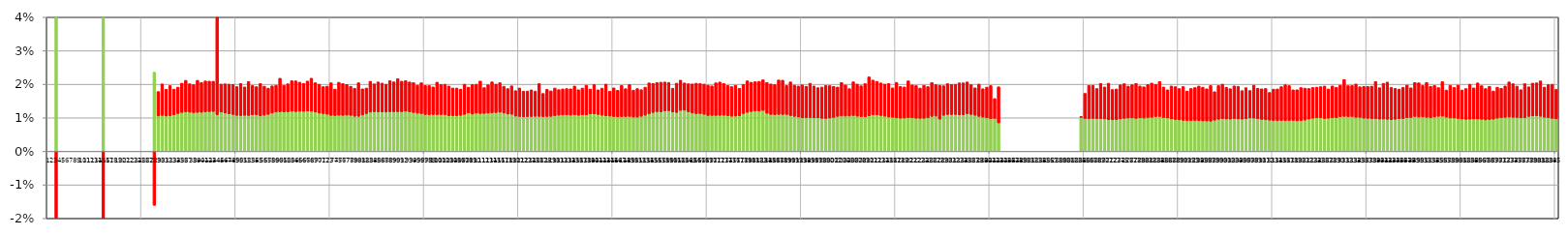
| Category | Тех потери % | НБф % |
|---|---|---|
| 0 | 0 | 0 |
| 1 | 0 | 0 |
| 2 | 1.826 | -1.804 |
| 3 | 0 | 0 |
| 4 | 0 | 0 |
| 5 | 0 | 0 |
| 6 | 0 | 0 |
| 7 | 0 | 0 |
| 8 | 0 | 0 |
| 9 | 0 | 0 |
| 10 | 0 | 0 |
| 11 | 0 | 0 |
| 12 | 0 | 0 |
| 13 | 0 | 0 |
| 14 | 1.826 | -1.856 |
| 15 | 0 | 0 |
| 16 | 0 | 0 |
| 17 | 0 | 0 |
| 18 | 0 | 0 |
| 19 | 0 | 0 |
| 20 | 0 | 0 |
| 21 | 0 | 0 |
| 22 | 0 | 0 |
| 23 | 0 | 0 |
| 24 | 0 | 0 |
| 25 | 0 | 0 |
| 26 | 0 | 0 |
| 27 | 0.024 | -0.016 |
| 28 | 0.011 | 0.007 |
| 29 | 0.011 | 0.009 |
| 30 | 0.011 | 0.008 |
| 31 | 0.011 | 0.009 |
| 32 | 0.011 | 0.008 |
| 33 | 0.011 | 0.008 |
| 34 | 0.012 | 0.009 |
| 35 | 0.012 | 0.009 |
| 36 | 0.012 | 0.008 |
| 37 | 0.012 | 0.008 |
| 38 | 0.012 | 0.01 |
| 39 | 0.012 | 0.009 |
| 40 | 0.012 | 0.009 |
| 41 | 0.012 | 0.009 |
| 42 | 0.012 | 0.009 |
| 43 | 0.011 | 0.059 |
| 44 | 0.012 | 0.008 |
| 45 | 0.011 | 0.009 |
| 46 | 0.011 | 0.009 |
| 47 | 0.011 | 0.009 |
| 48 | 0.011 | 0.009 |
| 49 | 0.011 | 0.01 |
| 50 | 0.011 | 0.008 |
| 51 | 0.011 | 0.01 |
| 52 | 0.011 | 0.009 |
| 53 | 0.011 | 0.008 |
| 54 | 0.011 | 0.01 |
| 55 | 0.011 | 0.009 |
| 56 | 0.011 | 0.008 |
| 57 | 0.011 | 0.008 |
| 58 | 0.012 | 0.008 |
| 59 | 0.012 | 0.01 |
| 60 | 0.012 | 0.008 |
| 61 | 0.012 | 0.008 |
| 62 | 0.012 | 0.009 |
| 63 | 0.012 | 0.009 |
| 64 | 0.012 | 0.009 |
| 65 | 0.012 | 0.008 |
| 66 | 0.012 | 0.009 |
| 67 | 0.012 | 0.01 |
| 68 | 0.012 | 0.009 |
| 69 | 0.011 | 0.009 |
| 70 | 0.011 | 0.008 |
| 71 | 0.011 | 0.008 |
| 72 | 0.011 | 0.01 |
| 73 | 0.011 | 0.008 |
| 74 | 0.011 | 0.01 |
| 75 | 0.011 | 0.009 |
| 76 | 0.011 | 0.009 |
| 77 | 0.011 | 0.009 |
| 78 | 0.01 | 0.008 |
| 79 | 0.01 | 0.01 |
| 80 | 0.011 | 0.008 |
| 81 | 0.011 | 0.008 |
| 82 | 0.012 | 0.009 |
| 83 | 0.012 | 0.008 |
| 84 | 0.012 | 0.009 |
| 85 | 0.012 | 0.009 |
| 86 | 0.012 | 0.008 |
| 87 | 0.012 | 0.009 |
| 88 | 0.012 | 0.009 |
| 89 | 0.012 | 0.01 |
| 90 | 0.012 | 0.009 |
| 91 | 0.012 | 0.009 |
| 92 | 0.012 | 0.009 |
| 93 | 0.012 | 0.009 |
| 94 | 0.011 | 0.008 |
| 95 | 0.011 | 0.009 |
| 96 | 0.011 | 0.009 |
| 97 | 0.011 | 0.009 |
| 98 | 0.011 | 0.008 |
| 99 | 0.011 | 0.01 |
| 100 | 0.011 | 0.009 |
| 101 | 0.011 | 0.009 |
| 102 | 0.011 | 0.009 |
| 103 | 0.011 | 0.008 |
| 104 | 0.011 | 0.008 |
| 105 | 0.011 | 0.008 |
| 106 | 0.011 | 0.009 |
| 107 | 0.011 | 0.008 |
| 108 | 0.011 | 0.009 |
| 109 | 0.011 | 0.009 |
| 110 | 0.011 | 0.01 |
| 111 | 0.011 | 0.008 |
| 112 | 0.011 | 0.008 |
| 113 | 0.011 | 0.009 |
| 114 | 0.012 | 0.009 |
| 115 | 0.012 | 0.009 |
| 116 | 0.011 | 0.008 |
| 117 | 0.011 | 0.008 |
| 118 | 0.011 | 0.008 |
| 119 | 0.011 | 0.008 |
| 120 | 0.01 | 0.009 |
| 121 | 0.01 | 0.008 |
| 122 | 0.01 | 0.008 |
| 123 | 0.01 | 0.008 |
| 124 | 0.01 | 0.008 |
| 125 | 0.01 | 0.01 |
| 126 | 0.01 | 0.007 |
| 127 | 0.01 | 0.008 |
| 128 | 0.01 | 0.008 |
| 129 | 0.011 | 0.008 |
| 130 | 0.011 | 0.008 |
| 131 | 0.011 | 0.008 |
| 132 | 0.011 | 0.008 |
| 133 | 0.011 | 0.008 |
| 134 | 0.011 | 0.009 |
| 135 | 0.011 | 0.008 |
| 136 | 0.011 | 0.008 |
| 137 | 0.011 | 0.009 |
| 138 | 0.011 | 0.007 |
| 139 | 0.011 | 0.009 |
| 140 | 0.011 | 0.007 |
| 141 | 0.011 | 0.008 |
| 142 | 0.011 | 0.009 |
| 143 | 0.011 | 0.007 |
| 144 | 0.01 | 0.009 |
| 145 | 0.01 | 0.008 |
| 146 | 0.01 | 0.009 |
| 147 | 0.01 | 0.008 |
| 148 | 0.01 | 0.01 |
| 149 | 0.01 | 0.008 |
| 150 | 0.01 | 0.009 |
| 151 | 0.01 | 0.008 |
| 152 | 0.011 | 0.008 |
| 153 | 0.011 | 0.009 |
| 154 | 0.012 | 0.009 |
| 155 | 0.012 | 0.009 |
| 156 | 0.012 | 0.009 |
| 157 | 0.012 | 0.009 |
| 158 | 0.012 | 0.008 |
| 159 | 0.012 | 0.007 |
| 160 | 0.012 | 0.009 |
| 161 | 0.012 | 0.009 |
| 162 | 0.012 | 0.008 |
| 163 | 0.012 | 0.008 |
| 164 | 0.011 | 0.009 |
| 165 | 0.011 | 0.009 |
| 166 | 0.011 | 0.009 |
| 167 | 0.011 | 0.009 |
| 168 | 0.011 | 0.009 |
| 169 | 0.011 | 0.009 |
| 170 | 0.011 | 0.01 |
| 171 | 0.011 | 0.01 |
| 172 | 0.011 | 0.009 |
| 173 | 0.011 | 0.009 |
| 174 | 0.01 | 0.009 |
| 175 | 0.011 | 0.009 |
| 176 | 0.011 | 0.008 |
| 177 | 0.011 | 0.009 |
| 178 | 0.012 | 0.009 |
| 179 | 0.012 | 0.009 |
| 180 | 0.012 | 0.009 |
| 181 | 0.012 | 0.009 |
| 182 | 0.012 | 0.009 |
| 183 | 0.011 | 0.009 |
| 184 | 0.011 | 0.009 |
| 185 | 0.011 | 0.009 |
| 186 | 0.011 | 0.01 |
| 187 | 0.011 | 0.01 |
| 188 | 0.011 | 0.009 |
| 189 | 0.011 | 0.01 |
| 190 | 0.01 | 0.009 |
| 191 | 0.01 | 0.009 |
| 192 | 0.01 | 0.01 |
| 193 | 0.01 | 0.009 |
| 194 | 0.01 | 0.01 |
| 195 | 0.01 | 0.01 |
| 196 | 0.01 | 0.009 |
| 197 | 0.01 | 0.009 |
| 198 | 0.01 | 0.01 |
| 199 | 0.01 | 0.01 |
| 200 | 0.01 | 0.009 |
| 201 | 0.01 | 0.009 |
| 202 | 0.011 | 0.01 |
| 203 | 0.011 | 0.009 |
| 204 | 0.011 | 0.008 |
| 205 | 0.011 | 0.01 |
| 206 | 0.01 | 0.01 |
| 207 | 0.01 | 0.009 |
| 208 | 0.01 | 0.01 |
| 209 | 0.011 | 0.012 |
| 210 | 0.011 | 0.01 |
| 211 | 0.011 | 0.01 |
| 212 | 0.011 | 0.01 |
| 213 | 0.01 | 0.01 |
| 214 | 0.01 | 0.01 |
| 215 | 0.01 | 0.009 |
| 216 | 0.01 | 0.011 |
| 217 | 0.01 | 0.009 |
| 218 | 0.01 | 0.009 |
| 219 | 0.01 | 0.011 |
| 220 | 0.01 | 0.01 |
| 221 | 0.01 | 0.01 |
| 222 | 0.01 | 0.009 |
| 223 | 0.01 | 0.01 |
| 224 | 0.01 | 0.009 |
| 225 | 0.01 | 0.01 |
| 226 | 0.011 | 0.009 |
| 227 | 0.01 | 0.01 |
| 228 | 0.011 | 0.009 |
| 229 | 0.011 | 0.009 |
| 230 | 0.011 | 0.009 |
| 231 | 0.011 | 0.009 |
| 232 | 0.011 | 0.01 |
| 233 | 0.011 | 0.01 |
| 234 | 0.011 | 0.009 |
| 235 | 0.011 | 0.009 |
| 236 | 0.011 | 0.008 |
| 237 | 0.01 | 0.01 |
| 238 | 0.01 | 0.008 |
| 239 | 0.01 | 0.009 |
| 240 | 0.01 | 0.01 |
| 241 | 0.01 | 0.006 |
| 242 | 0.008 | 0.011 |
| 243 | 0 | 0 |
| 244 | 0 | 0 |
| 245 | 0 | 0 |
| 246 | 0 | 0 |
| 247 | 0 | 0 |
| 248 | 0 | 0 |
| 249 | 0 | 0 |
| 250 | 0 | 0 |
| 251 | 0 | 0 |
| 252 | 0 | 0 |
| 253 | 0 | 0 |
| 254 | 0 | 0 |
| 255 | 0 | 0 |
| 256 | 0 | 0 |
| 257 | 0 | 0 |
| 258 | 0 | 0 |
| 259 | 0 | 0 |
| 260 | 0 | 0 |
| 261 | 0 | 0 |
| 262 | 0 | 0 |
| 263 | 0.01 | 0 |
| 264 | 0.01 | 0.007 |
| 265 | 0.01 | 0.01 |
| 266 | 0.01 | 0.01 |
| 267 | 0.01 | 0.009 |
| 268 | 0.01 | 0.011 |
| 269 | 0.01 | 0.01 |
| 270 | 0.009 | 0.011 |
| 271 | 0.009 | 0.009 |
| 272 | 0.009 | 0.009 |
| 273 | 0.01 | 0.01 |
| 274 | 0.01 | 0.01 |
| 275 | 0.01 | 0.01 |
| 276 | 0.01 | 0.01 |
| 277 | 0.01 | 0.01 |
| 278 | 0.01 | 0.01 |
| 279 | 0.01 | 0.009 |
| 280 | 0.01 | 0.01 |
| 281 | 0.01 | 0.01 |
| 282 | 0.01 | 0.01 |
| 283 | 0.01 | 0.01 |
| 284 | 0.01 | 0.009 |
| 285 | 0.01 | 0.008 |
| 286 | 0.01 | 0.01 |
| 287 | 0.009 | 0.01 |
| 288 | 0.009 | 0.009 |
| 289 | 0.009 | 0.01 |
| 290 | 0.009 | 0.009 |
| 291 | 0.009 | 0.01 |
| 292 | 0.009 | 0.01 |
| 293 | 0.009 | 0.01 |
| 294 | 0.009 | 0.01 |
| 295 | 0.009 | 0.01 |
| 296 | 0.009 | 0.011 |
| 297 | 0.009 | 0.009 |
| 298 | 0.01 | 0.01 |
| 299 | 0.01 | 0.01 |
| 300 | 0.01 | 0.009 |
| 301 | 0.01 | 0.009 |
| 302 | 0.01 | 0.01 |
| 303 | 0.01 | 0.01 |
| 304 | 0.01 | 0.008 |
| 305 | 0.01 | 0.009 |
| 306 | 0.01 | 0.008 |
| 307 | 0.01 | 0.01 |
| 308 | 0.01 | 0.009 |
| 309 | 0.01 | 0.009 |
| 310 | 0.009 | 0.009 |
| 311 | 0.009 | 0.008 |
| 312 | 0.009 | 0.009 |
| 313 | 0.009 | 0.009 |
| 314 | 0.009 | 0.01 |
| 315 | 0.009 | 0.011 |
| 316 | 0.009 | 0.01 |
| 317 | 0.009 | 0.009 |
| 318 | 0.009 | 0.009 |
| 319 | 0.009 | 0.01 |
| 320 | 0.009 | 0.01 |
| 321 | 0.01 | 0.009 |
| 322 | 0.01 | 0.009 |
| 323 | 0.01 | 0.009 |
| 324 | 0.01 | 0.009 |
| 325 | 0.01 | 0.01 |
| 326 | 0.01 | 0.009 |
| 327 | 0.01 | 0.009 |
| 328 | 0.01 | 0.009 |
| 329 | 0.01 | 0.009 |
| 330 | 0.01 | 0.011 |
| 331 | 0.01 | 0.009 |
| 332 | 0.01 | 0.009 |
| 333 | 0.01 | 0.01 |
| 334 | 0.01 | 0.009 |
| 335 | 0.01 | 0.009 |
| 336 | 0.01 | 0.01 |
| 337 | 0.01 | 0.01 |
| 338 | 0.01 | 0.011 |
| 339 | 0.01 | 0.009 |
| 340 | 0.01 | 0.011 |
| 341 | 0.01 | 0.011 |
| 342 | 0.009 | 0.01 |
| 343 | 0.01 | 0.009 |
| 344 | 0.01 | 0.009 |
| 345 | 0.01 | 0.009 |
| 346 | 0.01 | 0.01 |
| 347 | 0.01 | 0.009 |
| 348 | 0.01 | 0.01 |
| 349 | 0.01 | 0.01 |
| 350 | 0.01 | 0.009 |
| 351 | 0.01 | 0.01 |
| 352 | 0.01 | 0.009 |
| 353 | 0.01 | 0.009 |
| 354 | 0.01 | 0.009 |
| 355 | 0.01 | 0.01 |
| 356 | 0.01 | 0.008 |
| 357 | 0.01 | 0.01 |
| 358 | 0.01 | 0.009 |
| 359 | 0.01 | 0.01 |
| 360 | 0.01 | 0.009 |
| 361 | 0.01 | 0.009 |
| 362 | 0.01 | 0.01 |
| 363 | 0.01 | 0.009 |
| 364 | 0.01 | 0.011 |
| 365 | 0.01 | 0.01 |
| 366 | 0.009 | 0.009 |
| 367 | 0.009 | 0.01 |
| 368 | 0.01 | 0.008 |
| 369 | 0.01 | 0.009 |
| 370 | 0.01 | 0.009 |
| 371 | 0.01 | 0.009 |
| 372 | 0.01 | 0.01 |
| 373 | 0.01 | 0.01 |
| 374 | 0.01 | 0.009 |
| 375 | 0.01 | 0.008 |
| 376 | 0.01 | 0.01 |
| 377 | 0.01 | 0.009 |
| 378 | 0.011 | 0.01 |
| 379 | 0.011 | 0.01 |
| 380 | 0.01 | 0.011 |
| 381 | 0.01 | 0.009 |
| 382 | 0.01 | 0.01 |
| 383 | 0.01 | 0.01 |
| 384 | 0.01 | 0.009 |